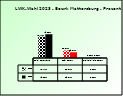
| Category | 2018 | 2023 |
|---|---|---|
| Bgld. Bauernbund | 0.714 | 0.791 |
| SPÖ Bauern | 0.25 | 0.191 |
| Freiheitliche Bauern | 0.035 | 0.018 |